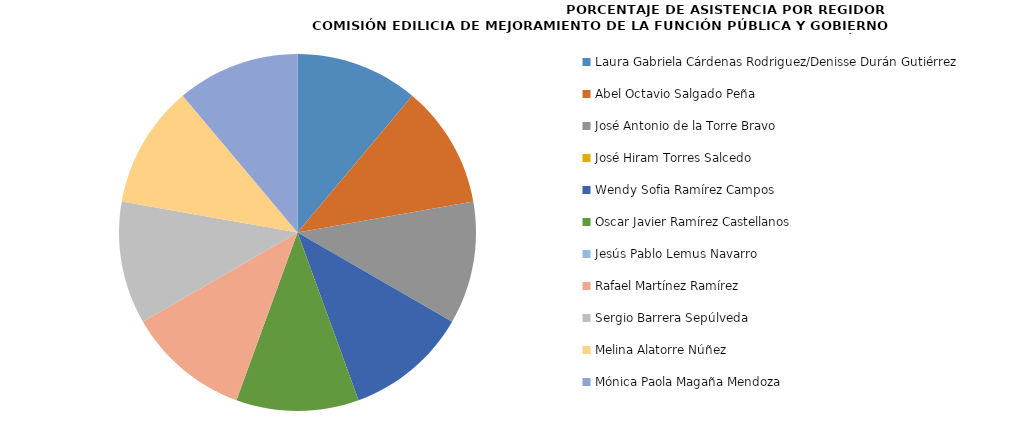
| Category | Series 0 |
|---|---|
| Laura Gabriela Cárdenas Rodriguez/Denisse Durán Gutiérrez | 100 |
| Abel Octavio Salgado Peña | 100 |
| José Antonio de la Torre Bravo | 100 |
| José Hiram Torres Salcedo | 0 |
| Wendy Sofia Ramírez Campos | 100 |
| Oscar Javier Ramírez Castellanos | 100 |
| Jesús Pablo Lemus Navarro  | 0 |
| Rafael Martínez Ramírez | 100 |
| Sergio Barrera Sepúlveda | 100 |
| Melina Alatorre Núñez | 100 |
| Mónica Paola Magaña Mendoza | 100 |